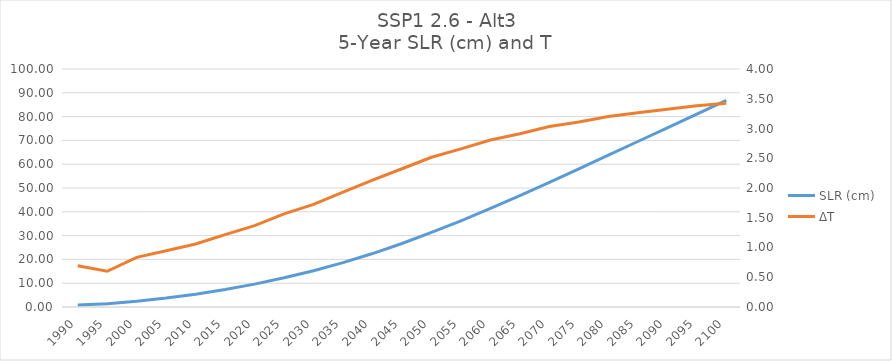
| Category | SLR (cm) |
|---|---|
| 1990.0 | 0.87 |
| 1995.0 | 1.399 |
| 2000.0 | 2.407 |
| 2005.0 | 3.755 |
| 2010.0 | 5.386 |
| 2015.0 | 7.344 |
| 2020.0 | 9.606 |
| 2025.0 | 12.264 |
| 2030.0 | 15.242 |
| 2035.0 | 18.639 |
| 2040.0 | 22.458 |
| 2045.0 | 26.682 |
| 2050.0 | 31.317 |
| 2055.0 | 36.229 |
| 2060.0 | 41.435 |
| 2065.0 | 46.805 |
| 2070.0 | 52.378 |
| 2075.0 | 58.025 |
| 2080.0 | 63.772 |
| 2085.0 | 69.539 |
| 2090.0 | 75.307 |
| 2095.0 | 81.066 |
| 2100.0 | 86.773 |